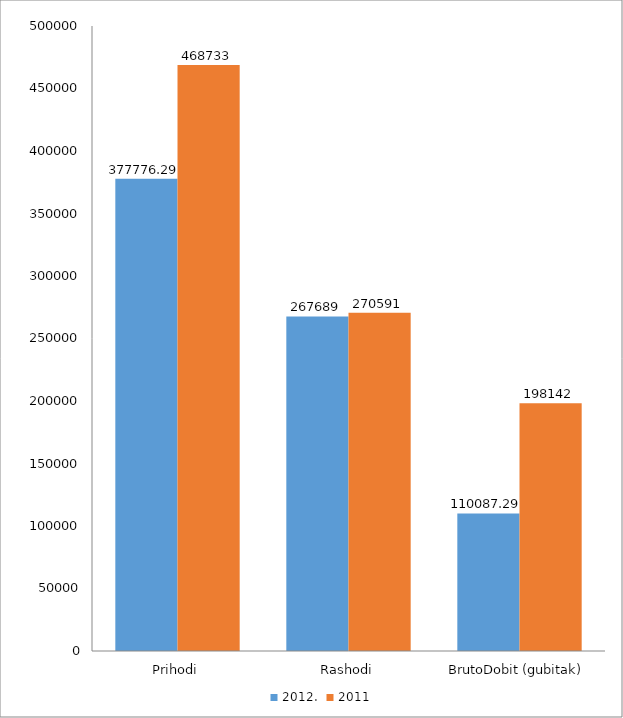
| Category | 2012. | 2011 |
|---|---|---|
| Prihodi | 377776.29 | 468733 |
| Rashodi | 267689 | 270591 |
| BrutoDobit (gubitak) | 110087.29 | 198142 |